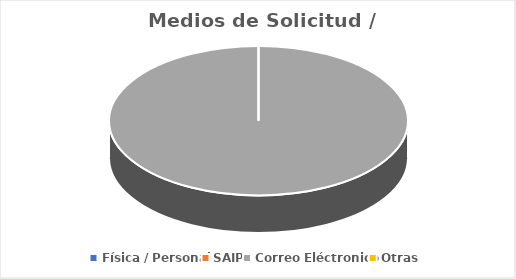
| Category | Series 0 |
|---|---|
| Física / Personal | 0 |
| SAIP | 0 |
| Correo Eléctronico | 9 |
| Otras | 0 |